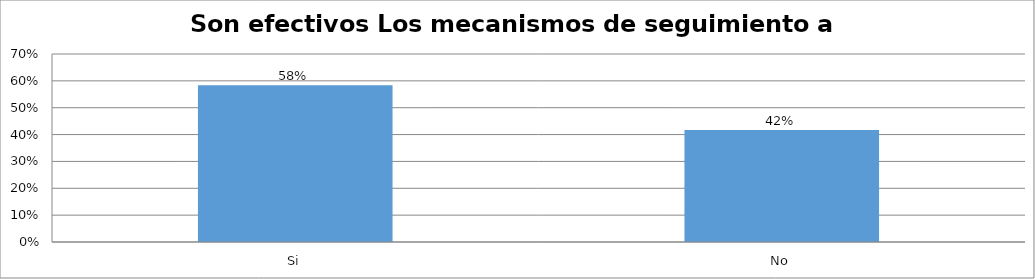
| Category | Series 0 |
|---|---|
| Si | 0.583 |
| No | 0.417 |